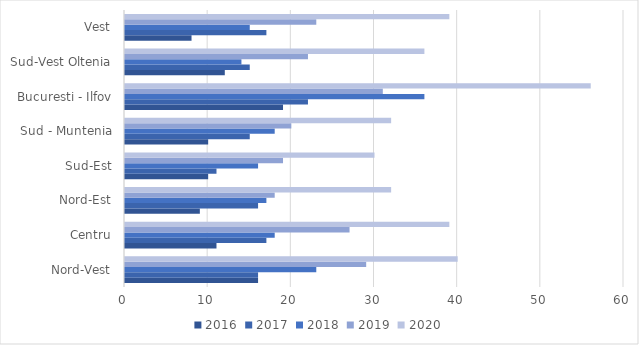
| Category | 2016 | 2017 | 2018 | 2019 | 2020 |
|---|---|---|---|---|---|
| Nord-Vest | 16 | 16 | 23 | 29 | 40 |
| Centru | 11 | 17 | 18 | 27 | 39 |
| Nord-Est | 9 | 16 | 17 | 18 | 32 |
| Sud-Est | 10 | 11 | 16 | 19 | 30 |
| Sud - Muntenia | 10 | 15 | 18 | 20 | 32 |
| Bucuresti - Ilfov | 19 | 22 | 36 | 31 | 56 |
| Sud-Vest Oltenia | 12 | 15 | 14 | 22 | 36 |
| Vest | 8 | 17 | 15 | 23 | 39 |